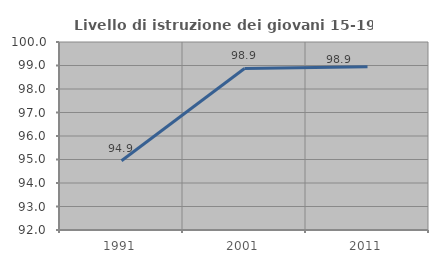
| Category | Livello di istruzione dei giovani 15-19 anni |
|---|---|
| 1991.0 | 94.947 |
| 2001.0 | 98.874 |
| 2011.0 | 98.95 |